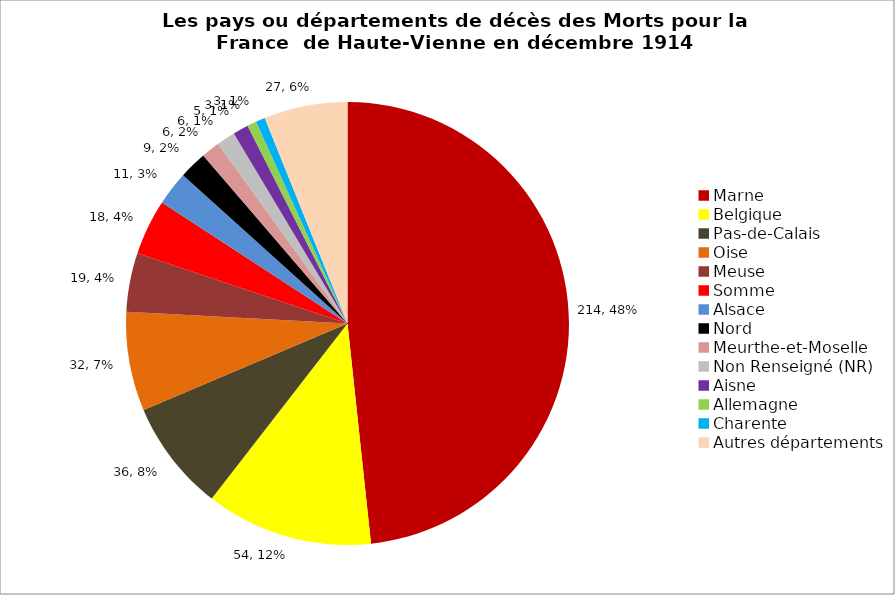
| Category | Les pays ou départements de décès des Morts pour la France  de Haute-Vienne en déembre 1914 |
|---|---|
| Marne  | 214 |
| Belgique | 54 |
| Pas-de-Calais | 36 |
| Oise  | 32 |
| Meuse | 19 |
| Somme | 18 |
| Alsace | 11 |
| Nord  | 9 |
| Meurthe-et-Moselle | 6 |
| Non Renseigné (NR) | 6 |
| Aisne | 5 |
| Allemagne | 3 |
| Charente   | 3 |
| Autres départements | 27 |